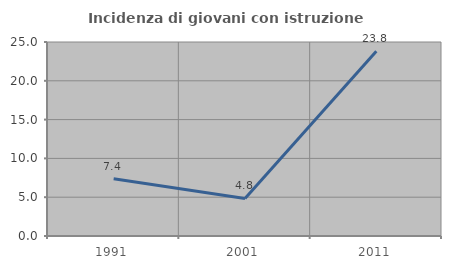
| Category | Incidenza di giovani con istruzione universitaria |
|---|---|
| 1991.0 | 7.368 |
| 2001.0 | 4.839 |
| 2011.0 | 23.81 |